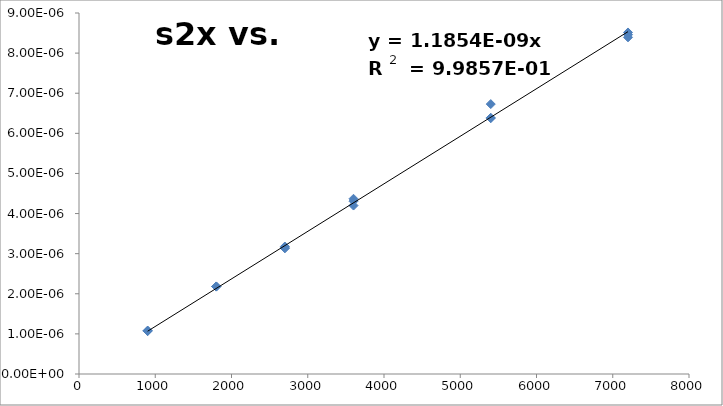
| Category | s2x vs. dtstop |
|---|---|
| 900.0 | 0 |
| 900.0 | 0 |
| 900.0 | 0 |
| 1800.0 | 0 |
| 1800.0 | 0 |
| 1800.0 | 0 |
| 2700.0 | 0 |
| 2700.0 | 0 |
| 2700.0 | 0 |
| 3600.0 | 0 |
| 3600.0 | 0 |
| 3600.0 | 0 |
| 5400.0 | 0 |
| 5400.0 | 0 |
| 5400.0 | 0 |
| 7200.0 | 0 |
| 7200.0 | 0 |
| 7200.0 | 0 |